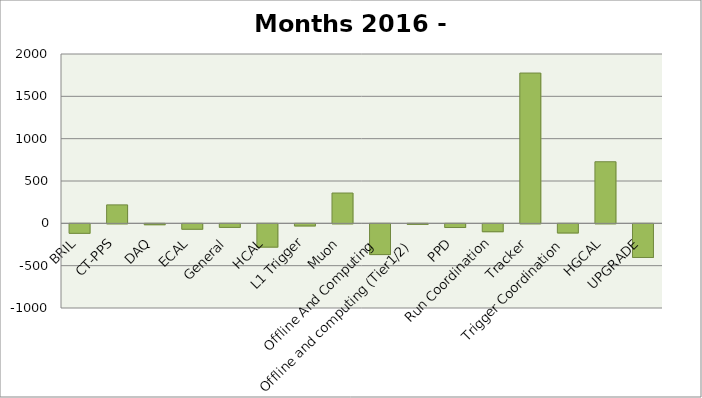
| Category | Series 0 |
|---|---|
| BRIL | -112 |
| CT-PPS | 218 |
| DAQ | -10.5 |
| ECAL | -64 |
| General | -42 |
| HCAL | -275 |
| L1 Trigger | -25 |
| Muon | 358 |
| Offline And Computing | -363 |
| Offline and computing (Tier1/2) | -6 |
| PPD | -43.5 |
| Run Coordination | -93 |
| Tracker | 1775.2 |
| Trigger Coordination | -108 |
| HGCAL | 727.5 |
| UPGRADE | -397.5 |